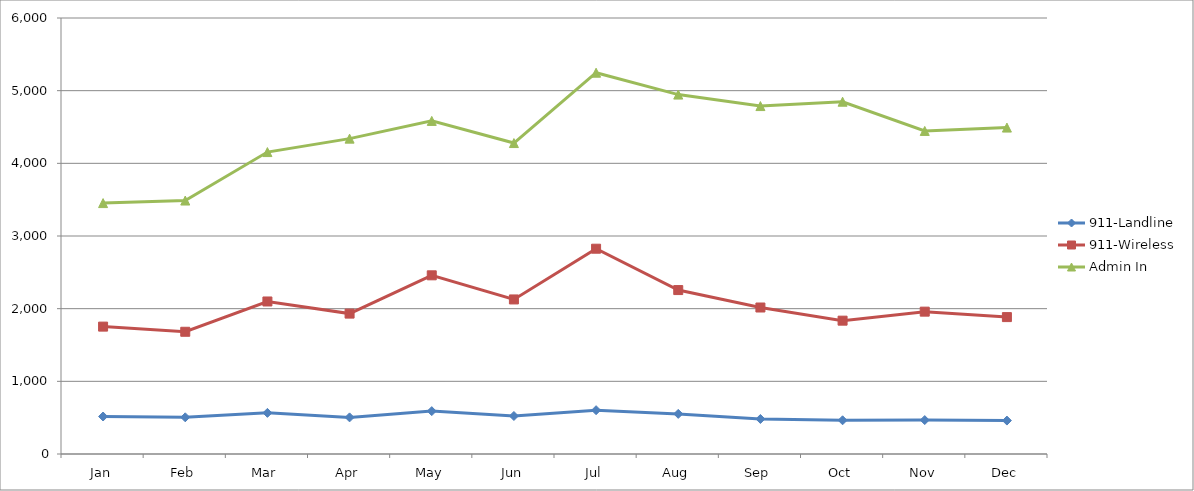
| Category | 911-Landline | 911-Wireless | Admin In |
|---|---|---|---|
| Jan | 516 | 1753 | 3453 |
| Feb | 505 | 1682 | 3488 |
| Mar | 566 | 2099 | 4155 |
| Apr | 504 | 1932 | 4340 |
| May | 590 | 2459 | 4584 |
| Jun | 523 | 2127 | 4279 |
| Jul | 603 | 2825 | 5247 |
| Aug | 552 | 2256 | 4946 |
| Sep | 482 | 2016 | 4788 |
| Oct | 464 | 1835 | 4848 |
| Nov | 467 | 1959 | 4446 |
| Dec | 460 | 1884 | 4492 |